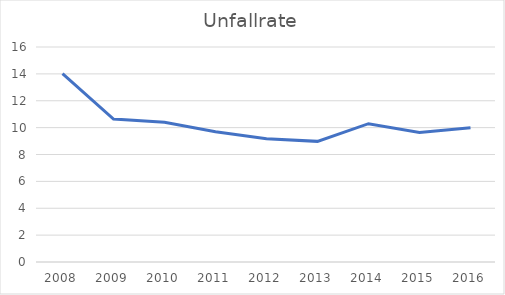
| Category | Unfallrate |
|---|---|
| 2008.0 | 14.023 |
| 2009.0 | 10.64 |
| 2010.0 | 10.394 |
| 2011.0 | 9.69 |
| 2012.0 | 9.18 |
| 2013.0 | 8.978 |
| 2014.0 | 10.293 |
| 2015.0 | 9.637 |
| 2016.0 | 9.996 |